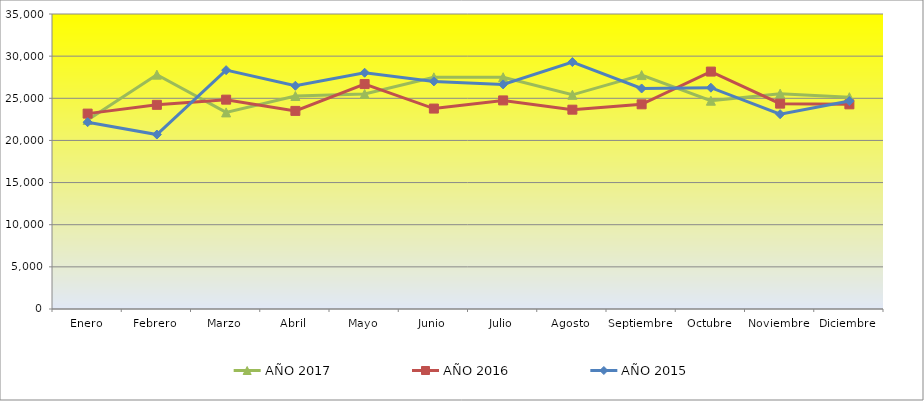
| Category | AÑO 2017 | AÑO 2016 | AÑO 2015 |
|---|---|---|---|
| Enero | 22427 | 23181 | 22166 |
| Febrero | 27805 | 24223 | 20699 |
| Marzo | 23326 | 24838 | 28338 |
| Abril | 25273 | 23504 | 26487 |
| Mayo | 25510 | 26687 | 28031 |
| Junio | 27485 | 23780 | 27003 |
| Julio | 27498 | 24748 | 26646 |
| Agosto | 25411 | 23649 | 29299 |
| Septiembre | 27750 | 24284 | 26164 |
| Octubre | 24712 | 28167 | 26254 |
| Noviembre | 25552 | 24365 | 23113 |
| Diciembre | 25130 | 24280 | 24671 |